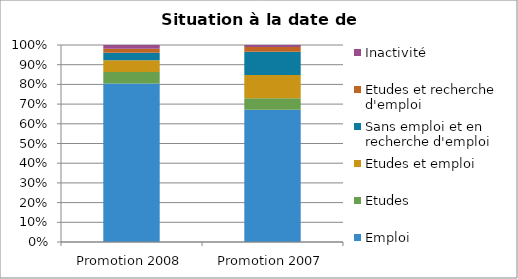
| Category | Emploi | Etudes | Etudes et emploi | Sans emploi et en recherche d'emploi | Etudes et recherche d'emploi | Inactivité |
|---|---|---|---|---|---|---|
| Promotion 2008 | 0.804 | 0.059 | 0.059 | 0.039 | 0.02 | 0.02 |
| Promotion 2007 | 0.671 | 0.059 | 0.118 | 0.118 | 0.024 | 0.012 |